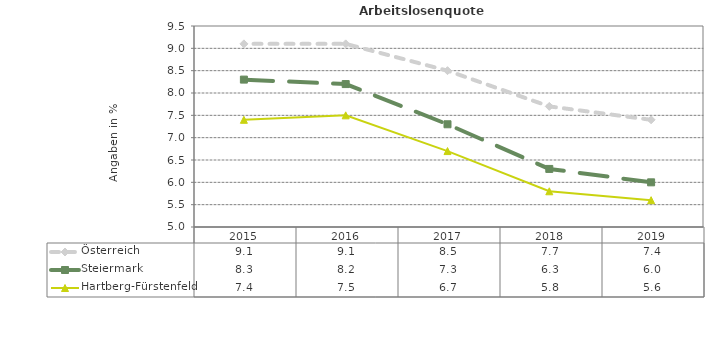
| Category | Österreich | Steiermark | Hartberg-Fürstenfeld |
|---|---|---|---|
| 2019.0 | 7.4 | 6 | 5.6 |
| 2018.0 | 7.7 | 6.3 | 5.8 |
| 2017.0 | 8.5 | 7.3 | 6.7 |
| 2016.0 | 9.1 | 8.2 | 7.5 |
| 2015.0 | 9.1 | 8.3 | 7.4 |